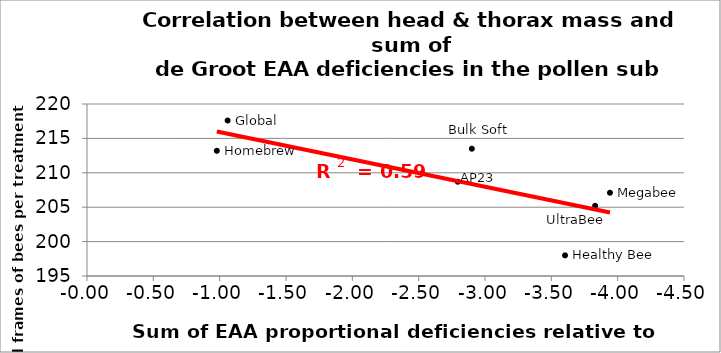
| Category | #REF! |
|---|---|
| 1.060068881685575 | 217.6 |
| 0.9786988110964332 | 213.2 |
| 2.90074481865285 | 213.5 |
| 2.7949080622347946 | 208.7 |
| 3.942002442002442 | 207.1 |
| 3.8298248882265282 | 205.2 |
| 3.6034015653220948 | 198 |